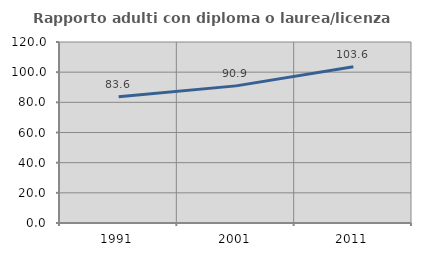
| Category | Rapporto adulti con diploma o laurea/licenza media  |
|---|---|
| 1991.0 | 83.636 |
| 2001.0 | 90.909 |
| 2011.0 | 103.636 |